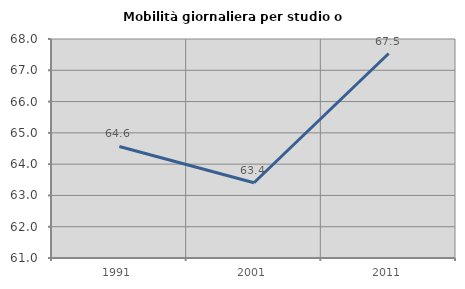
| Category | Mobilità giornaliera per studio o lavoro |
|---|---|
| 1991.0 | 64.566 |
| 2001.0 | 63.406 |
| 2011.0 | 67.535 |